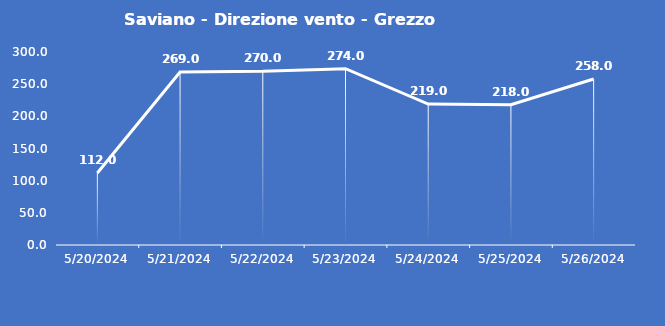
| Category | Saviano - Direzione vento - Grezzo (°N) |
|---|---|
| 5/20/24 | 112 |
| 5/21/24 | 269 |
| 5/22/24 | 270 |
| 5/23/24 | 274 |
| 5/24/24 | 219 |
| 5/25/24 | 218 |
| 5/26/24 | 258 |